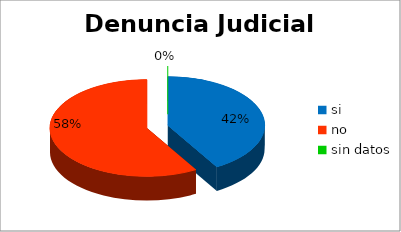
| Category | 2012 |
|---|---|
| si | 27 |
| no | 38 |
| sin datos | 0 |